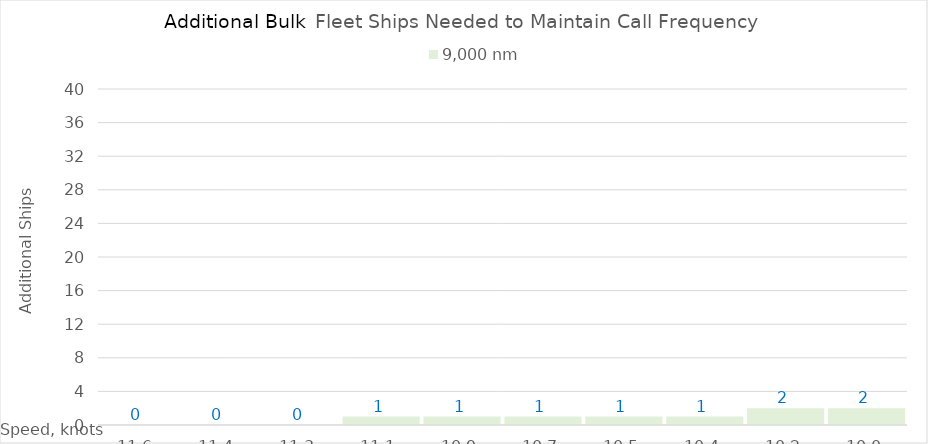
| Category | 9,000 |
|---|---|
| 11.620000000000001 | 0 |
| 11.440000000000001 | 0 |
| 11.260000000000002 | 0 |
| 11.080000000000002 | 1 |
| 10.900000000000002 | 1 |
| 10.720000000000002 | 1 |
| 10.540000000000003 | 1 |
| 10.360000000000003 | 1 |
| 10.180000000000003 | 2 |
| 10.000000000000004 | 2 |